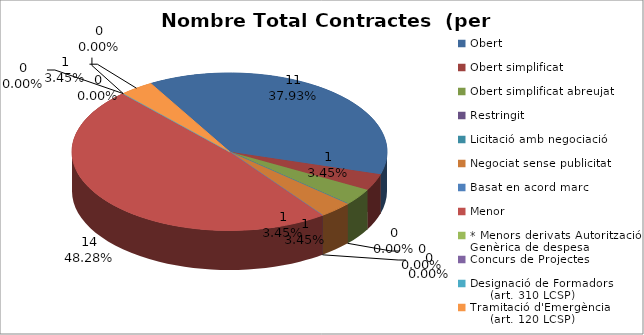
| Category | Nombre Total Contractes |
|---|---|
| Obert | 11 |
| Obert simplificat | 1 |
| Obert simplificat abreujat | 1 |
| Restringit | 0 |
| Licitació amb negociació | 0 |
| Negociat sense publicitat | 1 |
| Basat en acord marc | 0 |
| Menor | 14 |
| * Menors derivats Autorització Genèrica de despesa | 0 |
| Concurs de Projectes | 0 |
| Designació de Formadors
     (art. 310 LCSP) | 0 |
| Tramitació d'Emergència
     (art. 120 LCSP) | 1 |